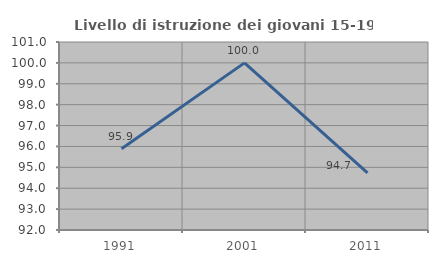
| Category | Livello di istruzione dei giovani 15-19 anni |
|---|---|
| 1991.0 | 95.89 |
| 2001.0 | 100 |
| 2011.0 | 94.737 |